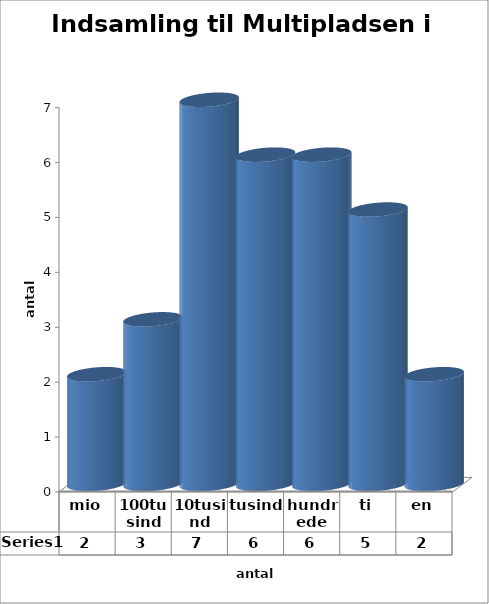
| Category | Series 0 |
|---|---|
| mio | 2 |
| 100tusind | 3 |
| 10tusind | 7 |
| tusind | 6 |
| hundrede | 6 |
| ti | 5 |
| en | 2 |